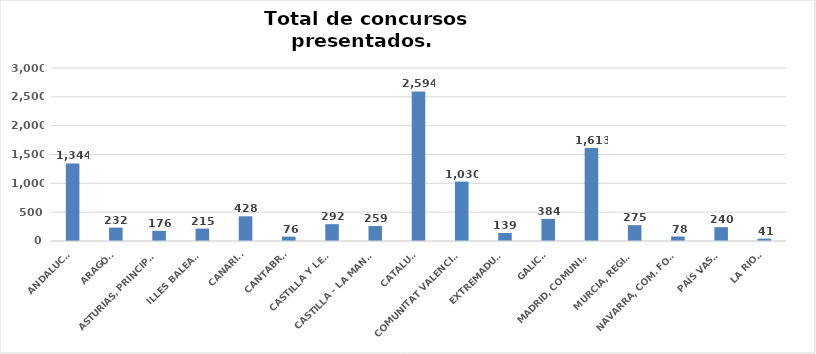
| Category | Series 0 |
|---|---|
| ANDALUCÍA | 1344 |
| ARAGÓN | 232 |
| ASTURIAS, PRINCIPADO | 176 |
| ILLES BALEARS | 215 |
| CANARIAS | 428 |
| CANTABRIA | 76 |
| CASTILLA Y LEÓN | 292 |
| CASTILLA - LA MANCHA | 259 |
| CATALUÑA | 2594 |
| COMUNITAT VALENCIANA | 1030 |
| EXTREMADURA | 139 |
| GALICIA | 384 |
| MADRID, COMUNIDAD | 1613 |
| MURCIA, REGIÓN | 275 |
| NAVARRA, COM. FORAL | 78 |
| PAÍS VASCO | 240 |
| LA RIOJA | 41 |